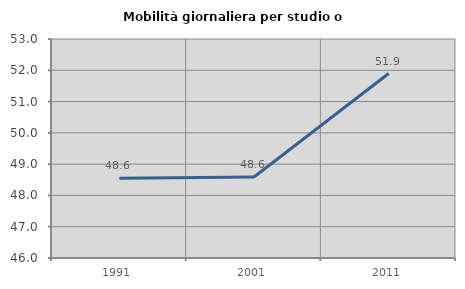
| Category | Mobilità giornaliera per studio o lavoro |
|---|---|
| 1991.0 | 48.553 |
| 2001.0 | 48.591 |
| 2011.0 | 51.895 |